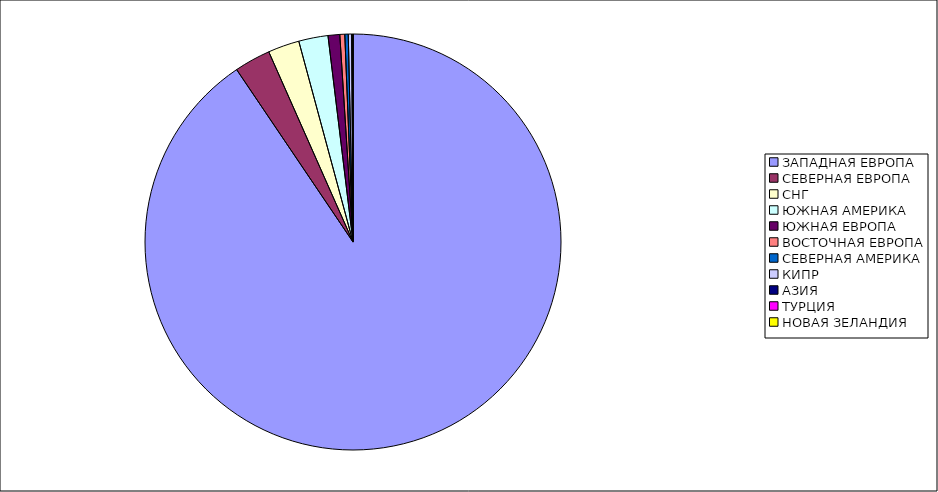
| Category | Оборот |
|---|---|
| ЗАПАДНАЯ ЕВРОПА | 0.905 |
| СЕВЕРНАЯ ЕВРОПА | 0.028 |
| СНГ | 0.024 |
| ЮЖНАЯ АМЕРИКА | 0.023 |
| ЮЖНАЯ ЕВРОПА | 0.009 |
| ВОСТОЧНАЯ ЕВРОПА | 0.004 |
| СЕВЕРНАЯ АМЕРИКА | 0.003 |
| КИПР | 0.003 |
| АЗИЯ | 0.001 |
| ТУРЦИЯ | 0 |
| НОВАЯ ЗЕЛАНДИЯ | 0 |